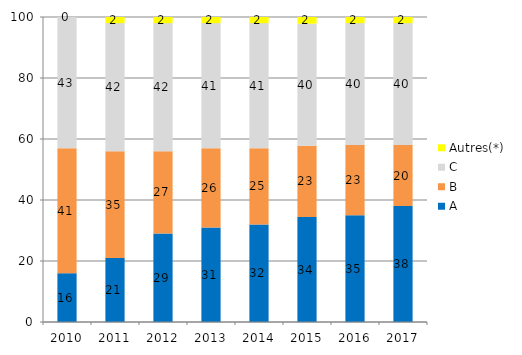
| Category | A | B | C | Autres(*) |
|---|---|---|---|---|
| 2010.0 | 16 | 41 | 43 | 0 |
| 2011.0 | 21 | 35 | 42 | 2 |
| 2012.0 | 29 | 27 | 42 | 2 |
| 2013.0 | 31 | 26 | 41 | 2 |
| 2014.0 | 32 | 25 | 41 | 2 |
| 2015.0 | 34.4 | 23.4 | 40 | 2.2 |
| 2016.0 | 35 | 23 | 40 | 2 |
| 2017.0 | 38 | 20 | 40 | 2 |